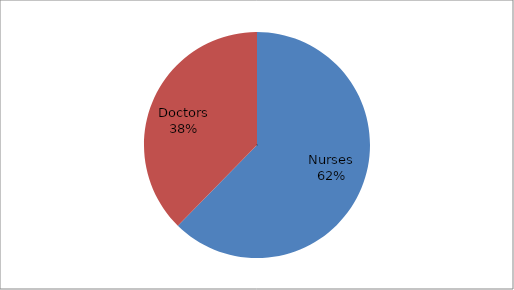
| Category | Yes | No |
|---|---|---|
| Nurses | 106 | 28 |
| Doctors | 64 | 45 |